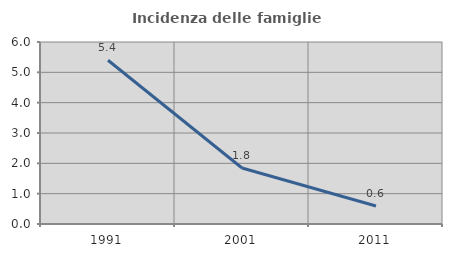
| Category | Incidenza delle famiglie numerose |
|---|---|
| 1991.0 | 5.399 |
| 2001.0 | 1.845 |
| 2011.0 | 0.595 |